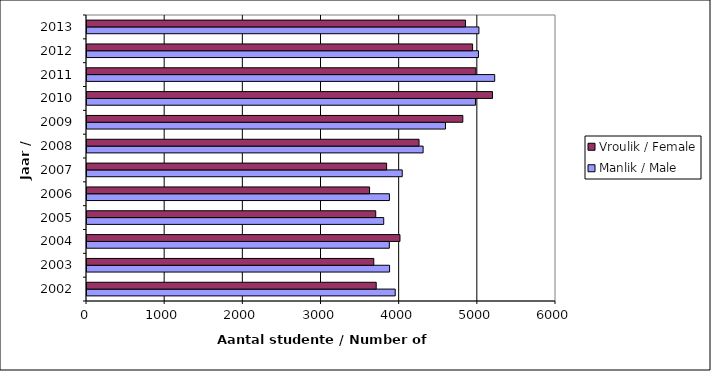
| Category | Manlik / Male | Vroulik / Female |
|---|---|---|
| 2002.0 | 3943 | 3700 |
| 2003.0 | 3871 | 3669 |
| 2004.0 | 3868 | 4004 |
| 2005.0 | 3796 | 3694 |
| 2006.0 | 3869 | 3615 |
| 2007.0 | 4033 | 3833 |
| 2008.0 | 4300 | 4248 |
| 2009.0 | 4586 | 4808 |
| 2010.0 | 4970 | 5188 |
| 2011.0 | 5216 | 4975 |
| 2012.0 | 5008 | 4933 |
| 2013.0 | 5014 | 4842 |